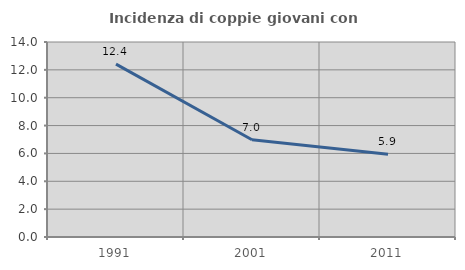
| Category | Incidenza di coppie giovani con figli |
|---|---|
| 1991.0 | 12.409 |
| 2001.0 | 6.983 |
| 2011.0 | 5.941 |